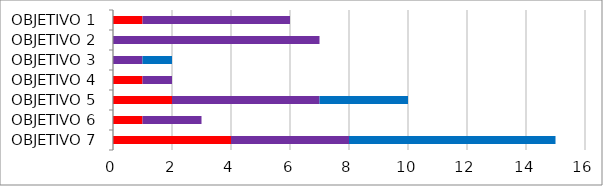
| Category | Series 0 | Series 1 | Series 2 |
|---|---|---|---|
| OBJETIVO 1 | 1 | 5 | 0 |
| OBJETIVO 2 | 0 | 7 | 0 |
| OBJETIVO 3 | 0 | 1 | 1 |
| OBJETIVO 4 | 1 | 1 | 0 |
| OBJETIVO 5 | 2 | 5 | 3 |
| OBJETIVO 6 | 1 | 2 | 0 |
| OBJETIVO 7 | 4 | 4 | 7 |